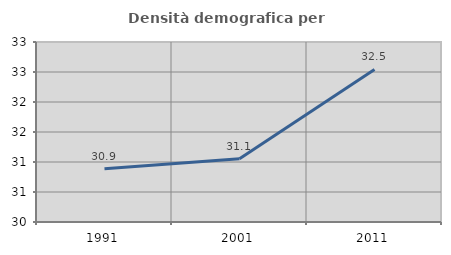
| Category | Densità demografica |
|---|---|
| 1991.0 | 30.889 |
| 2001.0 | 31.054 |
| 2011.0 | 32.542 |